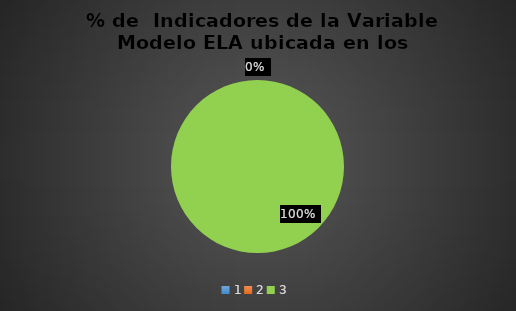
| Category | Series 0 |
|---|---|
| 0 | 0 |
| 1 | 0 |
| 2 | 1 |